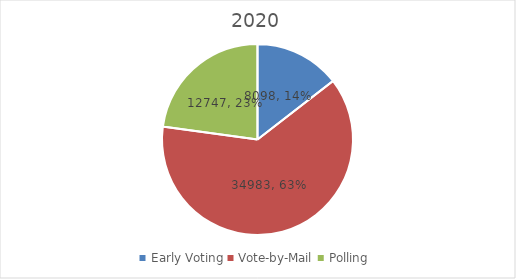
| Category | Series 0 |
|---|---|
| Early Voting | 8098 |
| Vote-by-Mail | 34983 |
| Polling | 12747 |